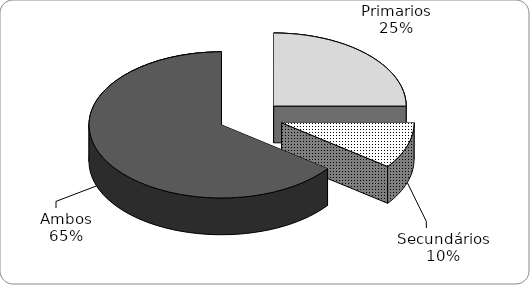
| Category | Series 0 |
|---|---|
| Primarios | 22 |
| Secundários | 9 |
| Ambos | 57 |